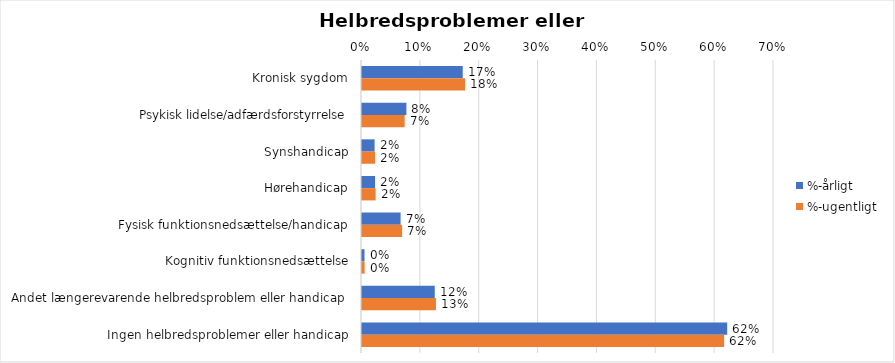
| Category | %-årligt | %-ugentligt |
|---|---|---|
| Kronisk sygdom | 0.171 | 0.175 |
| Psykisk lidelse/adfærdsforstyrrelse | 0.075 | 0.072 |
| Synshandicap | 0.021 | 0.022 |
| Hørehandicap | 0.022 | 0.023 |
| Fysisk funktionsnedsættelse/handicap | 0.066 | 0.068 |
| Kognitiv funktionsnedsættelse | 0.004 | 0.004 |
| Andet længerevarende helbredsproblem eller handicap  | 0.124 | 0.126 |
| Ingen helbredsproblemer eller handicap | 0.62 | 0.615 |